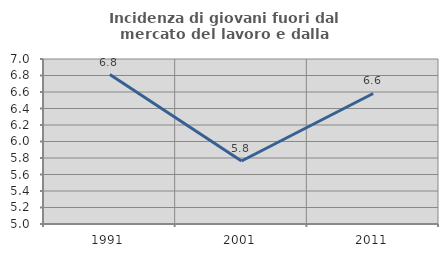
| Category | Incidenza di giovani fuori dal mercato del lavoro e dalla formazione  |
|---|---|
| 1991.0 | 6.811 |
| 2001.0 | 5.764 |
| 2011.0 | 6.582 |